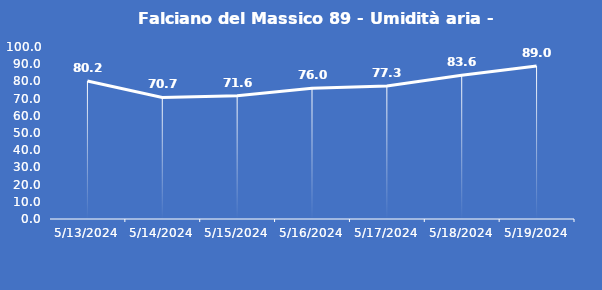
| Category | Falciano del Massico 89 - Umidità aria - Grezzo (%) |
|---|---|
| 5/13/24 | 80.2 |
| 5/14/24 | 70.7 |
| 5/15/24 | 71.6 |
| 5/16/24 | 76 |
| 5/17/24 | 77.3 |
| 5/18/24 | 83.6 |
| 5/19/24 | 89 |